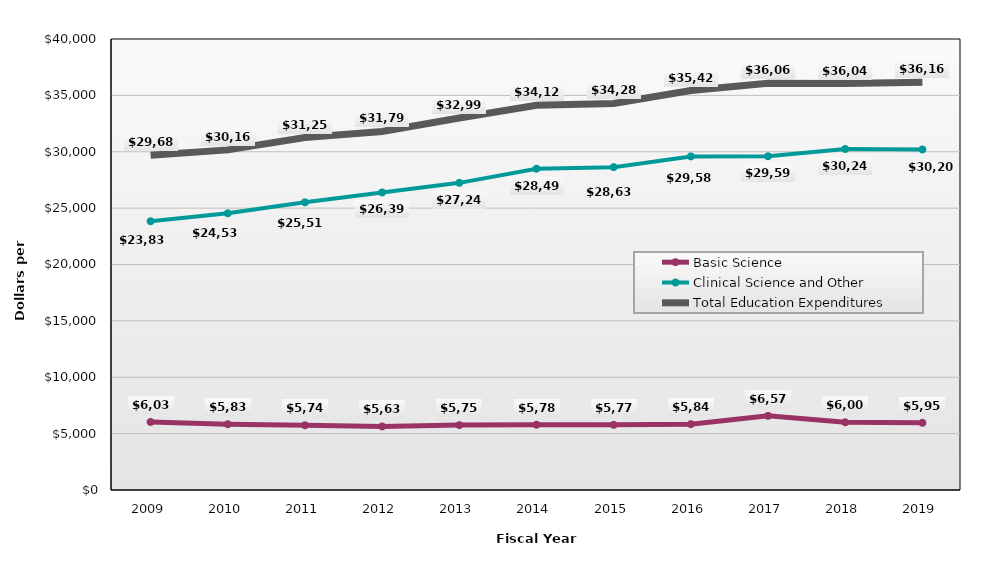
| Category | Basic Science | Clinical Science and Other | Total Education Expenditures |
|---|---|---|---|
| 2009.0 | 6035 | 23837 | 29682 |
| 2010.0 | 5833 | 24538 | 30165 |
| 2011.0 | 5741 | 25514 | 31255 |
| 2012.0 | 5637 | 26392 | 31799 |
| 2013.0 | 5756 | 27241 | 32997 |
| 2014.0 | 5787 | 28493 | 34121 |
| 2015.0 | 5778 | 28636 | 34288 |
| 2016.0 | 5841 | 29586 | 35426 |
| 2017.0 | 6575 | 29598 | 36066 |
| 2018.0 | 6007 | 30247 | 36044 |
| 2019.0 | 5959 | 30204 | 36162 |